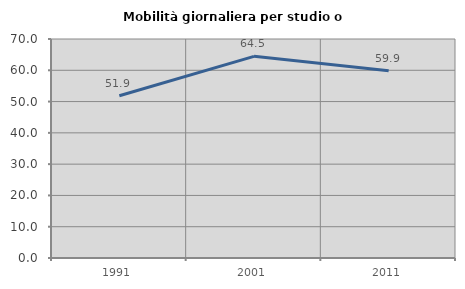
| Category | Mobilità giornaliera per studio o lavoro |
|---|---|
| 1991.0 | 51.852 |
| 2001.0 | 64.463 |
| 2011.0 | 59.859 |